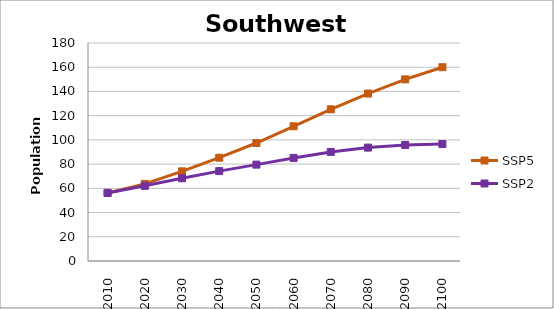
| Category | SSP5 | SSP2 |
|---|---|---|
| 2010.0 | 56211570 | 56211570 |
| 2020.0 | 63693442 | 62056210 |
| 2030.0 | 74017331 | 68334815 |
| 2040.0 | 85288746 | 74226368 |
| 2050.0 | 97418126 | 79571975 |
| 2060.0 | 111228869 | 85118288 |
| 2070.0 | 125239761 | 90075290 |
| 2080.0 | 138275424 | 93634215 |
| 2090.0 | 149986816 | 95770658 |
| 2100.0 | 159998709 | 96574989 |